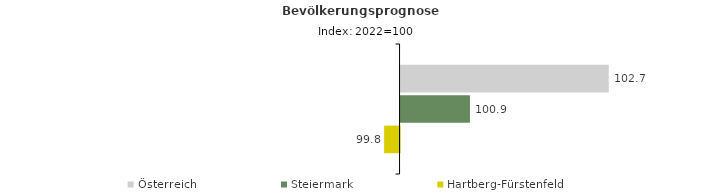
| Category | Österreich | Steiermark | Hartberg-Fürstenfeld |
|---|---|---|---|
| 2022.0 | 102.7 | 100.9 | 99.8 |